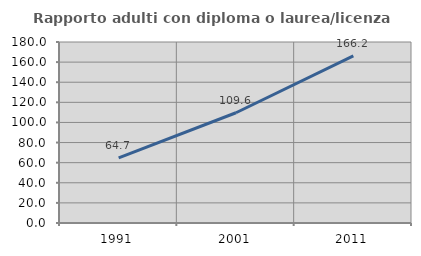
| Category | Rapporto adulti con diploma o laurea/licenza media  |
|---|---|
| 1991.0 | 64.706 |
| 2001.0 | 109.639 |
| 2011.0 | 166.154 |